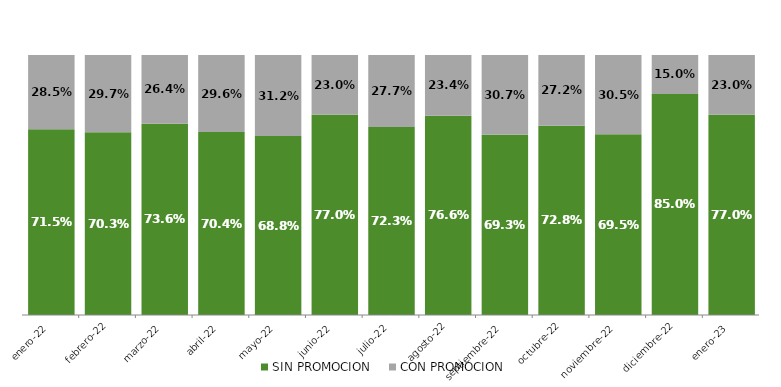
| Category | SIN PROMOCION   | CON PROMOCION   |
|---|---|---|
| 2022-01-01 | 0.715 | 0.285 |
| 2022-02-01 | 0.703 | 0.297 |
| 2022-03-01 | 0.736 | 0.264 |
| 2022-04-01 | 0.704 | 0.296 |
| 2022-05-01 | 0.688 | 0.312 |
| 2022-06-01 | 0.77 | 0.23 |
| 2022-07-01 | 0.723 | 0.277 |
| 2022-08-01 | 0.766 | 0.234 |
| 2022-09-01 | 0.693 | 0.307 |
| 2022-10-01 | 0.728 | 0.272 |
| 2022-11-01 | 0.695 | 0.305 |
| 2022-12-01 | 0.85 | 0.15 |
| 2023-01-01 | 0.77 | 0.23 |